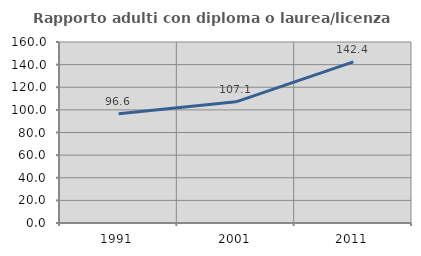
| Category | Rapporto adulti con diploma o laurea/licenza media  |
|---|---|
| 1991.0 | 96.579 |
| 2001.0 | 107.104 |
| 2011.0 | 142.448 |